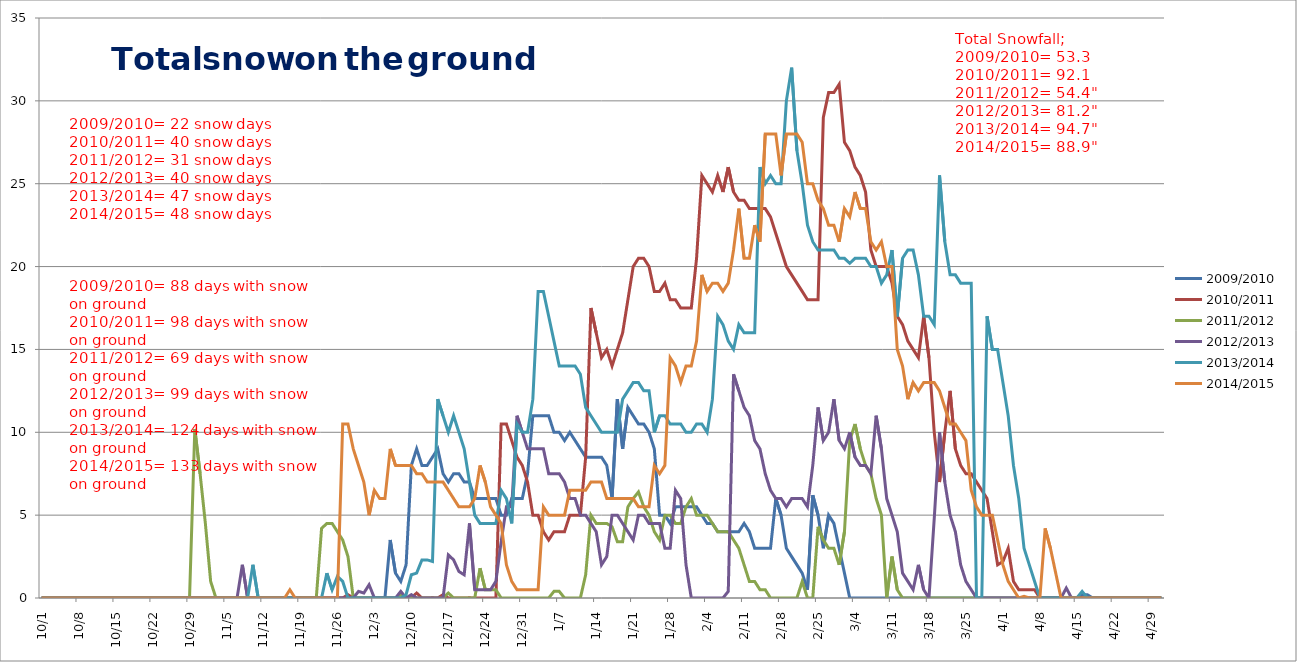
| Category | 2009/2010 | 2010/2011 | 2011/2012 | 2012/2013 | 2013/2014 | 2014/2015 |
|---|---|---|---|---|---|---|
| 2010-10-01 | 0 | 0 | 0 | 0 | 0 | 0 |
| 2010-10-02 | 0 | 0 | 0 | 0 | 0 | 0 |
| 2010-10-03 | 0 | 0 | 0 | 0 | 0 | 0 |
| 2010-10-04 | 0 | 0 | 0 | 0 | 0 | 0 |
| 2010-10-05 | 0 | 0 | 0 | 0 | 0 | 0 |
| 2010-10-06 | 0 | 0 | 0 | 0 | 0 | 0 |
| 2010-10-07 | 0 | 0 | 0 | 0 | 0 | 0 |
| 2010-10-08 | 0 | 0 | 0 | 0 | 0 | 0 |
| 2010-10-09 | 0 | 0 | 0 | 0 | 0 | 0 |
| 2010-10-10 | 0 | 0 | 0 | 0 | 0 | 0 |
| 2010-10-11 | 0 | 0 | 0 | 0 | 0 | 0 |
| 2010-10-12 | 0 | 0 | 0 | 0 | 0 | 0 |
| 2010-10-13 | 0 | 0 | 0 | 0 | 0 | 0 |
| 2010-10-14 | 0 | 0 | 0 | 0 | 0 | 0 |
| 2010-10-15 | 0 | 0 | 0 | 0 | 0 | 0 |
| 2010-10-16 | 0 | 0 | 0 | 0 | 0 | 0 |
| 2010-10-17 | 0 | 0 | 0 | 0 | 0 | 0 |
| 2010-10-18 | 0 | 0 | 0 | 0 | 0 | 0 |
| 2010-10-19 | 0 | 0 | 0 | 0 | 0 | 0 |
| 2010-10-20 | 0 | 0 | 0 | 0 | 0 | 0 |
| 2010-10-21 | 0 | 0 | 0 | 0 | 0 | 0 |
| 2010-10-22 | 0 | 0 | 0 | 0 | 0 | 0 |
| 2010-10-23 | 0 | 0 | 0 | 0 | 0 | 0 |
| 2010-10-24 | 0 | 0 | 0 | 0 | 0 | 0 |
| 2010-10-25 | 0 | 0 | 0 | 0 | 0 | 0 |
| 2010-10-26 | 0 | 0 | 0 | 0 | 0 | 0 |
| 2010-10-27 | 0 | 0 | 0 | 0 | 0 | 0 |
| 2010-10-28 | 0 | 0 | 0 | 0 | 0 | 0 |
| 2010-10-29 | 0 | 0 | 0 | 0 | 0 | 0 |
| 2010-10-30 | 0 | 0 | 10.2 | 0 | 0 | 0 |
| 2010-10-31 | 0 | 0 | 7.5 | 0 | 0 | 0 |
| 2010-11-01 | 0 | 0 | 4.5 | 0 | 0 | 0 |
| 2010-11-02 | 0 | 0 | 1 | 0 | 0 | 0 |
| 2010-11-03 | 0 | 0 | 0 | 0 | 0 | 0 |
| 2010-11-04 | 0 | 0 | 0 | 0 | 0 | 0 |
| 2010-11-05 | 0 | 0 | 0 | 0 | 0 | 0 |
| 2010-11-06 | 0 | 0 | 0 | 0 | 0 | 0 |
| 2010-11-07 | 0 | 0 | 0 | 0 | 0 | 0 |
| 2010-11-08 | 0 | 0 | 0 | 2 | 0 | 0 |
| 2010-11-09 | 0 | 0 | 0 | 0 | 0 | 0 |
| 2010-11-10 | 0 | 0 | 0 | 0 | 2 | 0 |
| 2010-11-11 | 0 | 0 | 0 | 0 | 0 | 0 |
| 2010-11-12 | 0 | 0 | 0 | 0 | 0 | 0 |
| 2010-11-13 | 0 | 0 | 0 | 0 | 0 | 0 |
| 2010-11-14 | 0 | 0 | 0 | 0 | 0 | 0 |
| 2010-11-15 | 0 | 0 | 0 | 0 | 0 | 0 |
| 2010-11-16 | 0 | 0 | 0 | 0 | 0 | 0 |
| 2010-11-17 | 0 | 0 | 0 | 0 | 0 | 0.5 |
| 2010-11-18 | 0 | 0 | 0 | 0 | 0 | 0 |
| 2010-11-19 | 0 | 0.01 | 0 | 0 | 0 | 0 |
| 2010-11-20 | 0 | 0 | 0 | 0 | 0 | 0 |
| 2010-11-21 | 0 | 0 | 0 | 0 | 0 | 0 |
| 2010-11-22 | 0 | 0 | 0 | 0 | 0 | 0 |
| 2010-11-23 | 0 | 0 | 4.2 | 0 | 0 | 0 |
| 2010-11-24 | 0 | 0 | 4.5 | 0 | 1.5 | 0 |
| 2010-11-25 | 0 | 0 | 4.5 | 0 | 0.5 | 0 |
| 2010-11-26 | 0 | 0 | 4 | 0 | 1.3 | 0 |
| 2010-11-27 | 0 | 0 | 3.5 | 0 | 1 | 10.5 |
| 2010-11-28 | 0 | 0.2 | 2.5 | 0 | 0 | 10.5 |
| 2010-11-29 | 0 | 0 | 0 | 0 | 0 | 9 |
| 2010-11-30 | 0 | 0 | 0 | 0.4 | 0 | 8 |
| 2010-12-01 | 0 | 0 | 0 | 0.3 | 0 | 7 |
| 2010-12-02 | 0 | 0 | 0 | 0.8 | 0 | 5 |
| 2010-12-03 | 0 | 0 | 0 | 0 | 0 | 6.5 |
| 2010-12-04 | 0 | 0 | 0 | 0 | 0 | 6 |
| 2010-12-05 | 0 | 0 | 0 | 0 | 0 | 6 |
| 2010-12-06 | 3.5 | 0 | 0 | 0 | 0 | 9 |
| 2010-12-07 | 1.5 | 0 | 0 | 0 | 0 | 8 |
| 2010-12-08 | 1 | 0 | 0.2 | 0.4 | 0 | 8 |
| 2010-12-09 | 2 | 0 | 0 | 0 | 0.2 | 8 |
| 2010-12-10 | 8 | 0 | 0 | 0.2 | 1.4 | 8 |
| 2010-12-11 | 9 | 0.3 | 0 | 0 | 1.5 | 7.5 |
| 2010-12-12 | 8 | 0 | 0 | 0 | 2.3 | 7.5 |
| 2010-12-13 | 8 | 0 | 0 | 0 | 2.3 | 7 |
| 2010-12-14 | 8.5 | 0.01 | 0 | 0 | 2.2 | 7 |
| 2010-12-15 | 9 | 0 | 0 | 0 | 12 | 7 |
| 2010-12-16 | 7.5 | 0.2 | 0 | 0 | 11 | 7 |
| 2010-12-17 | 7 | 0 | 0.3 | 2.6 | 10 | 6.5 |
| 2010-12-18 | 7.5 | 0 | 0 | 2.3 | 11 | 6 |
| 2010-12-19 | 7.5 | 0 | 0 | 1.6 | 10 | 5.5 |
| 2010-12-20 | 7 | 0 | 0 | 1.4 | 9 | 5.5 |
| 2010-12-21 | 7 | 0.01 | 0 | 4.5 | 7 | 5.5 |
| 2010-12-22 | 6 | 0 | 0 | 0.5 | 5 | 6 |
| 2010-12-23 | 6 | 0 | 1.8 | 0.5 | 4.5 | 8 |
| 2010-12-24 | 6 | 0 | 0.5 | 0.5 | 4.5 | 7 |
| 2010-12-25 | 6 | 0 | 0.5 | 0.5 | 4.5 | 5.5 |
| 2010-12-26 | 6 | 0 | 0.5 | 1 | 4.5 | 5 |
| 2010-12-27 | 5 | 10.5 | 0 | 3.4 | 6.5 | 4.5 |
| 2010-12-28 | 5 | 10.5 | 0 | 5.5 | 6 | 2 |
| 2010-12-29 | 6 | 9.5 | 0 | 5.5 | 4.5 | 1 |
| 2010-12-30 | 6 | 8.5 | 0 | 11 | 10.5 | 0.5 |
| 2010-12-31 | 6 | 8 | 0 | 10 | 10 | 0.5 |
| 2011-01-01 | 7.5 | 7 | 0 | 9 | 10 | 0.5 |
| 2011-01-02 | 11 | 5 | 0 | 9 | 12 | 0.5 |
| 2011-01-03 | 11 | 5 | 0 | 9 | 18.5 | 0.5 |
| 2011-01-04 | 11 | 4 | 0 | 9 | 18.5 | 5.5 |
| 2011-01-05 | 11 | 3.5 | 0 | 7.5 | 17 | 5 |
| 2011-01-06 | 10 | 4 | 0.4 | 7.5 | 15.5 | 5 |
| 2011-01-07 | 10 | 4 | 0.4 | 7.5 | 14 | 5 |
| 2011-01-08 | 9.5 | 4 | 0 | 7 | 14 | 5 |
| 2011-01-09 | 10 | 5 | 0 | 6 | 14 | 6.5 |
| 2011-01-10 | 9.5 | 5 | 0 | 6 | 14 | 6.5 |
| 2011-01-11 | 9 | 5 | 0 | 5 | 13.5 | 6.5 |
| 2011-01-12 | 8.5 | 8.5 | 1.4 | 5 | 11.5 | 6.5 |
| 2011-01-13 | 8.5 | 17.5 | 5 | 4.5 | 11 | 7 |
| 2011-01-14 | 8.5 | 16 | 4.5 | 4 | 10.5 | 7 |
| 2011-01-15 | 8.5 | 14.5 | 4.5 | 2 | 10 | 7 |
| 2011-01-16 | 8 | 15 | 4.5 | 2.5 | 10 | 6 |
| 2011-01-17 | 6 | 14 | 4.3 | 5 | 10 | 6 |
| 2011-01-18 | 12 | 15 | 3.4 | 5 | 10 | 6 |
| 2011-01-19 | 9 | 16 | 3.4 | 4.5 | 12 | 6 |
| 2011-01-20 | 11.5 | 18 | 5.5 | 4 | 12.5 | 6 |
| 2011-01-21 | 11 | 20 | 6 | 3.5 | 13 | 6 |
| 2011-01-22 | 10.5 | 20.5 | 6.4 | 5 | 13 | 5.5 |
| 2011-01-23 | 10.5 | 20.5 | 5.5 | 5 | 12.5 | 5.5 |
| 2011-01-24 | 10 | 20 | 5 | 4.5 | 12.5 | 5.5 |
| 2011-01-25 | 9 | 18.5 | 4 | 4.5 | 10 | 8 |
| 2011-01-26 | 5 | 18.5 | 3.5 | 4.5 | 11 | 7.5 |
| 2011-01-27 | 5 | 19 | 5 | 3 | 11 | 8 |
| 2011-01-28 | 4.5 | 18 | 5 | 3 | 10.5 | 14.5 |
| 2011-01-29 | 5.5 | 18 | 4.5 | 6.5 | 10.5 | 14 |
| 2011-01-30 | 5.5 | 17.5 | 4.5 | 6 | 10.5 | 13 |
| 2011-01-31 | 5.5 | 17.5 | 5.5 | 2 | 10 | 14 |
| 2011-02-01 | 5.5 | 17.5 | 6 | 0 | 10 | 14 |
| 2011-02-02 | 5.5 | 20.5 | 5 | 0 | 10.5 | 15.5 |
| 2011-02-03 | 5 | 25.5 | 5 | 0 | 10.5 | 19.5 |
| 2011-02-04 | 4.5 | 25 | 5 | 0 | 10 | 18.5 |
| 2011-02-05 | 4.5 | 24.5 | 4.5 | 0 | 12 | 19 |
| 2011-02-06 | 4 | 25.5 | 4 | 0 | 17 | 19 |
| 2011-02-07 | 4 | 24.5 | 4 | 0 | 16.5 | 18.5 |
| 2011-02-08 | 4 | 26 | 4 | 0.4 | 15.5 | 19 |
| 2011-02-09 | 4 | 24.5 | 3.5 | 13.5 | 15 | 21 |
| 2011-02-10 | 4 | 24 | 3 | 12.5 | 16.5 | 23.5 |
| 2011-02-11 | 4.5 | 24 | 2 | 11.5 | 16 | 20.5 |
| 2011-02-12 | 4 | 23.5 | 1 | 11 | 16 | 20.5 |
| 2011-02-13 | 3 | 23.5 | 1 | 9.5 | 16 | 22.5 |
| 2011-02-14 | 3 | 23.5 | 0.5 | 9 | 26 | 21.5 |
| 2011-02-15 | 3 | 23.5 | 0.5 | 7.5 | 25 | 28 |
| 2011-02-16 | 3 | 23 | 0 | 6.5 | 25.5 | 28 |
| 2011-02-17 | 6 | 22 | 0 | 6 | 25 | 28 |
| 2011-02-18 | 5 | 21 | 0 | 6 | 25 | 25.5 |
| 2011-02-19 | 3 | 20 | 0 | 5.5 | 30 | 28 |
| 2011-02-20 | 2.5 | 19.5 | 0 | 6 | 32 | 28 |
| 2011-02-21 | 2 | 19 | 0 | 6 | 27 | 28 |
| 2011-02-22 | 1.5 | 18.5 | 1 | 6 | 25 | 27.5 |
| 2011-02-23 | 0.5 | 18 | 0 | 5.5 | 22.5 | 25 |
| 2011-02-24 | 6.2 | 18 | 0 | 8 | 21.5 | 25 |
| 2011-02-25 | 5 | 18 | 4.3 | 11.5 | 21 | 24 |
| 2011-02-26 | 3 | 29 | 3.5 | 9.5 | 21 | 23.5 |
| 2011-02-27 | 5 | 30.5 | 3 | 10 | 21 | 22.5 |
| 2011-02-28 | 4.5 | 30.5 | 3 | 12 | 21 | 22.5 |
| 2011-03-01 | 3 | 31 | 2 | 9.5 | 20.5 | 21.5 |
| 2011-03-02 | 1.5 | 27.5 | 4 | 9 | 20.5 | 23.5 |
| 2011-03-03 | 0 | 27 | 9.5 | 10 | 20.2 | 23 |
| 2011-03-04 | 0 | 26 | 10.5 | 8.5 | 20.5 | 24.5 |
| 2011-03-05 | 0 | 25.5 | 9 | 8 | 20.5 | 23.5 |
| 2011-03-06 | 0 | 24.5 | 8 | 8 | 20.5 | 23.5 |
| 2011-03-07 | 0 | 21 | 7.5 | 7.5 | 20 | 21.5 |
| 2011-03-08 | 0 | 20 | 6 | 11 | 20 | 21 |
| 2011-03-09 | 0 | 20 | 5 | 9 | 19 | 21.5 |
| 2011-03-10 | 0 | 20 | 0 | 6 | 19.5 | 20 |
| 2011-03-11 | 0 | 19 | 2.5 | 5 | 21 | 20 |
| 2011-03-12 | 0 | 17 | 0.5 | 4 | 17 | 15 |
| 2011-03-13 | 0 | 16.5 | 0 | 1.5 | 20.5 | 14 |
| 2011-03-14 | 0 | 15.5 | 0 | 1 | 21 | 12 |
| 2011-03-15 | 0 | 15 | 0 | 0.5 | 21 | 13 |
| 2011-03-16 | 0 | 14.5 | 0 | 2 | 19.5 | 12.5 |
| 2011-03-17 | 0 | 17 | 0 | 0.5 | 17 | 13 |
| 2011-03-18 | 0 | 14.5 | 0 | 0 | 17 | 13 |
| 2011-03-19 | 0 | 10 | 0 | 4.8 | 16.5 | 13 |
| 2011-03-20 | 0 | 7 | 0 | 10 | 25.5 | 12.5 |
| 2011-03-21 | 0 | 10 | 0 | 7 | 21.5 | 11.5 |
| 2011-03-22 | 0 | 12.5 | 0 | 5 | 19.5 | 10.5 |
| 2011-03-23 | 0 | 9 | 0 | 4 | 19.5 | 10.5 |
| 2011-03-24 | 0 | 8 | 0 | 2 | 19 | 10 |
| 2011-03-25 | 0 | 7.5 | 0 | 1 | 19 | 9.5 |
| 2011-03-26 | 0 | 7.5 | 0 | 0.5 | 19 | 6.5 |
| 2011-03-27 | 0 | 7 | 0 | 0 | 0 | 5.5 |
| 2011-03-28 | 0 | 6.5 | 0 | 0 | 0 | 5 |
| 2011-03-29 | 0 | 6 | 0 | 0 | 17 | 5 |
| 2011-03-30 | 0 | 4 | 0 | 0 | 15 | 5 |
| 2011-03-31 | 0 | 2 | 0 | 0 | 15 | 3.5 |
| 2011-04-01 | 0 | 2.2 | 0 | 0 | 13 | 2 |
| 2011-04-02 | 0 | 3 | 0 | 0 | 11 | 1 |
| 2011-04-03 | 0 | 1 | 0 | 0 | 8 | 0.5 |
| 2011-04-04 | 0 | 0.5 | 0 | 0 | 6 | 0 |
| 2011-04-05 | 0 | 0.5 | 0 | 0 | 3 | 0.1 |
| 2011-04-06 | 0 | 0.5 | 0 | 0 | 2 | 0 |
| 2011-04-07 | 0 | 0.5 | 0 | 0 | 1 | 0 |
| 2011-04-08 | 0 | 0 | 0 | 0 | 0 | 0 |
| 2011-04-09 | 0 | 0 | 0 | 0 | 0 | 4.2 |
| 2011-04-10 | 0 | 0 | 0 | 0 | 0 | 3 |
| 2011-04-11 | 0 | 0 | 0 | 0 | 0 | 1.5 |
| 2011-04-12 | 0 | 0 | 0 | 0 | 0 | 0 |
| 2011-04-13 | 0 | 0 | 0 | 0.6 | 0 | 0 |
| 2011-04-14 | 0 | 0 | 0 | 0 | 0 | 0 |
| 2011-04-15 | 0 | 0 | 0 | 0 | 0 | 0 |
| 2011-04-16 | 0.2 | 0 | 0 | 0 | 0.4 | 0 |
| 2011-04-17 | 0.2 | 0 | 0 | 0 | 0 | 0 |
| 2011-04-18 | 0 | 0 | 0 | 0 | 0 | 0 |
| 2011-04-19 | 0 | 0 | 0 | 0 | 0 | 0 |
| 2011-04-20 | 0 | 0 | 0 | 0 | 0 | 0 |
| 2011-04-21 | 0 | 0 | 0 | 0 | 0 | 0 |
| 2011-04-22 | 0 | 0 | 0 | 0 | 0 | 0 |
| 2011-04-23 | 0 | 0 | 0 | 0 | 0 | 0 |
| 2011-04-24 | 0 | 0 | 0 | 0 | 0 | 0 |
| 2011-04-25 | 0 | 0 | 0 | 0 | 0 | 0 |
| 2011-04-26 | 0 | 0 | 0 | 0 | 0 | 0 |
| 2011-04-27 | 0 | 0 | 0 | 0 | 0 | 0 |
| 2011-04-28 | 0 | 0 | 0 | 0 | 0 | 0 |
| 2011-04-29 | 0 | 0 | 0 | 0 | 0 | 0 |
| 2011-04-30 | 0 | 0 | 0 | 0 | 0 | 0 |
| 2011-05-01 | 0 | 0 | 0 | 0 | 0 | 0 |